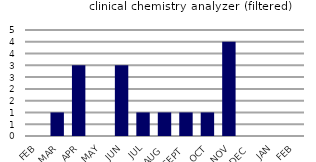
| Category | clinical chemistry analyzer (filtered) |
|---|---|
| FEB | 0 |
| MAR | 1 |
| APR | 3 |
| MAY | 0 |
| JUN | 3 |
| JUL | 1 |
| AUG | 1 |
| SEPT | 1 |
| OCT | 1 |
| NOV | 4 |
| DEC | 0 |
| JAN | 0 |
| FEB | 0 |